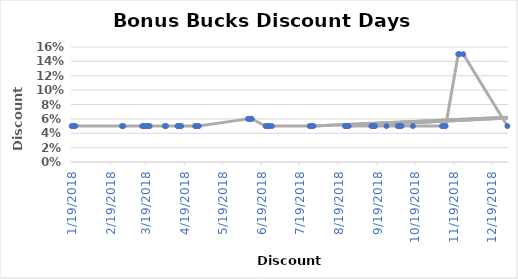
| Category | Discount |
|---|---|
| 12/31/18 | 0.05 |
| 11/26/18 | 0.15 |
| 11/23/18 | 0.15 |
| 11/22/18 | 0.15 |
| 11/12/18 | 0.05 |
| 11/11/18 | 0.05 |
| 11/10/18 | 0.05 |
| 11/9/18 | 0.05 |
| 10/17/18 | 0.05 |
| 10/8/18 | 0.05 |
| 10/7/18 | 0.05 |
| 10/6/18 | 0.05 |
| 10/5/18 | 0.05 |
| 9/26/18 | 0.05 |
| 9/17/18 | 0.05 |
| 9/16/18 | 0.05 |
| 9/15/18 | 0.05 |
| 9/14/18 | 0.05 |
| 8/27/18 | 0.05 |
| 8/26/18 | 0.05 |
| 8/25/18 | 0.05 |
| 8/24/18 | 0.05 |
| 8/8/19 | 0.08 |
| 7/30/18 | 0.05 |
| 7/29/18 | 0.05 |
| 7/28/18 | 0.05 |
| 7/27/18 | 0.05 |
| 6/27/18 | 0.05 |
| 6/25/18 | 0.05 |
| 6/24/18 | 0.05 |
| 6/23/18 | 0.05 |
| 6/22/18 | 0.05 |
| 6/11/18 | 0.06 |
| 6/10/18 | 0.06 |
| 6/9/18 | 0.06 |
| 6/8/18 | 0.06 |
| 4/30/18 | 0.05 |
| 4/29/18 | 0.05 |
| 4/28/18 | 0.05 |
| 4/27/18 | 0.05 |
| 4/16/18 | 0.05 |
| 4/15/18 | 0.05 |
| 4/14/18 | 0.05 |
| 4/13/18 | 0.05 |
| 4/4/18 | 0.05 |
| 4/3/18 | 0.05 |
| 3/22/18 | 0.05 |
| 3/21/18 | 0.05 |
| 3/20/18 | 0.05 |
| 3/19/18 | 0.05 |
| 3/18/18 | 0.05 |
| 3/17/18 | 0.05 |
| 3/16/18 | 0.05 |
| 3/1/18 | 0.05 |
| 2/28/18 | 0.05 |
| 1/22/18 | 0.05 |
| 1/21/18 | 0.05 |
| 1/20/18 | 0.05 |
| 1/19/18 | 0.05 |